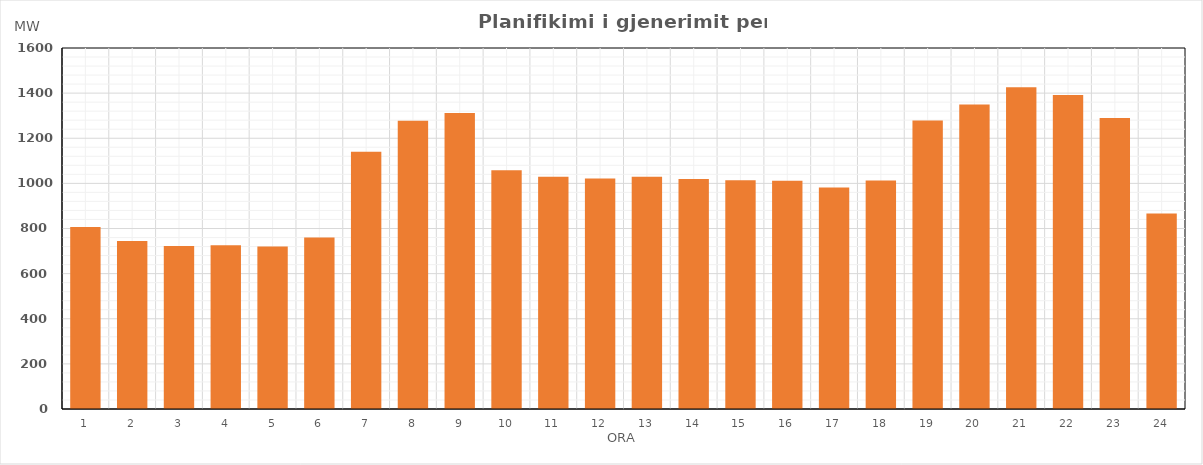
| Category | Max (MW) |
|---|---|
| 0 | 807.07 |
| 1 | 744.08 |
| 2 | 722.86 |
| 3 | 725.25 |
| 4 | 719.88 |
| 5 | 759.72 |
| 6 | 1140.66 |
| 7 | 1277.06 |
| 8 | 1312.37 |
| 9 | 1057.67 |
| 10 | 1029.82 |
| 11 | 1021.1 |
| 12 | 1029.04 |
| 13 | 1019.05 |
| 14 | 1013.66 |
| 15 | 1011.09 |
| 16 | 981.69 |
| 17 | 1013.23 |
| 18 | 1279.15 |
| 19 | 1349.37 |
| 20 | 1426.03 |
| 21 | 1391.23 |
| 22 | 1290.14 |
| 23 | 866.16 |